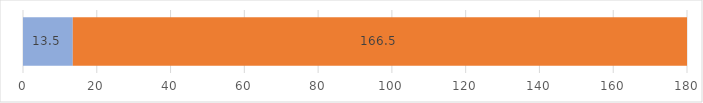
| Category | absolviert | übrig |
|---|---|---|
| 0 | 13.5 | 166.5 |